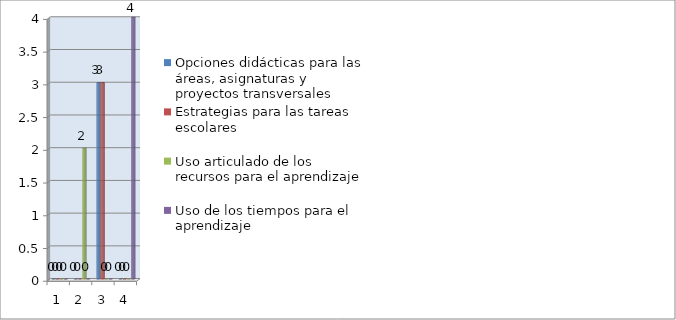
| Category | Opciones didácticas para las áreas, asignaturas y proyectos transversales | Estrategias para las tareas
escolares  | Uso articulado de los recursos para el aprendizaje | Uso de los tiempos para el
aprendizaje |
|---|---|---|---|---|
| 0 | 0 | 0 | 0 | 0 |
| 1 | 0 | 0 | 2 | 0 |
| 2 | 3 | 3 | 0 | 0 |
| 3 | 0 | 0 | 0 | 4 |